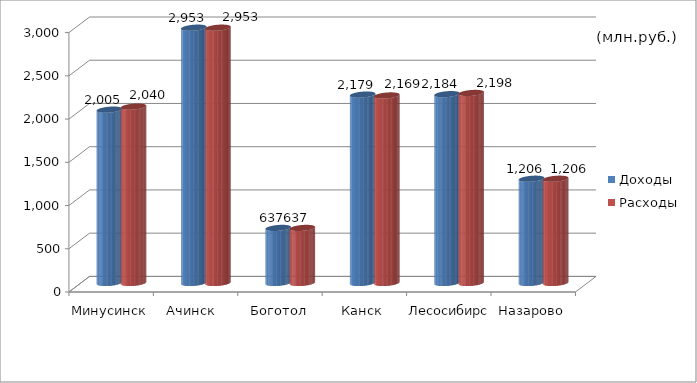
| Category | Доходы | Расходы |
|---|---|---|
| Минусинск | 2005 | 2040 |
| Ачинск  | 2953 | 2953 |
| Боготол | 637 | 637 |
| Канск | 2179 | 2169 |
| Лесосибирск | 2184 | 2198 |
| Назарово | 1206 | 1206 |